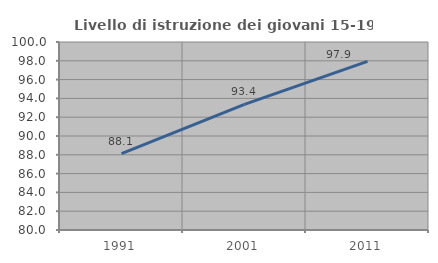
| Category | Livello di istruzione dei giovani 15-19 anni |
|---|---|
| 1991.0 | 88.115 |
| 2001.0 | 93.367 |
| 2011.0 | 97.945 |